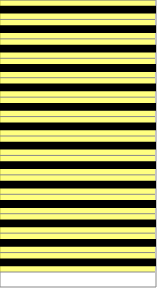
| Category | Series 0 |
|---|---|
| 0 | 1 |
| 1 | 1 |
| 2 | 1 |
| 3 | 1 |
| 4 | 1 |
| 5 | 1 |
| 6 | 1 |
| 7 | 1 |
| 8 | 1 |
| 9 | 1 |
| 10 | 1 |
| 11 | 1 |
| 12 | 1 |
| 13 | 1 |